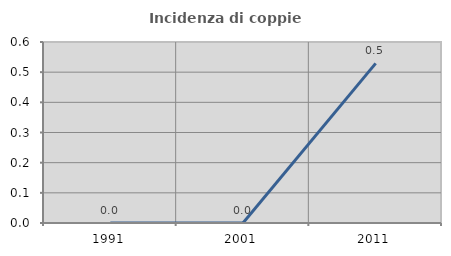
| Category | Incidenza di coppie miste |
|---|---|
| 1991.0 | 0 |
| 2001.0 | 0 |
| 2011.0 | 0.529 |